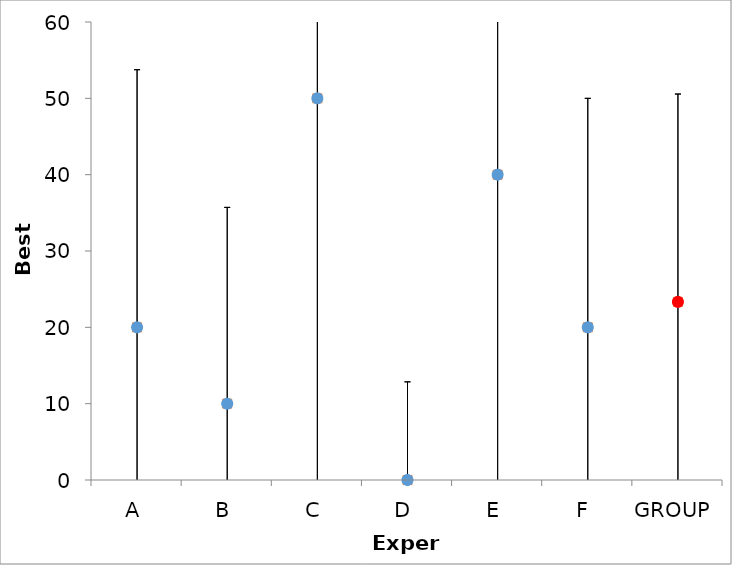
| Category | Series 1 | Series 0 |
|---|---|---|
| A | 20 | 20 |
| B | 10 | 10 |
| C | 50 | 50 |
| D | 0 | 0 |
| E | 40 | 40 |
| F | 20 | 20 |
| GROUP | 23.333 | 23.333 |